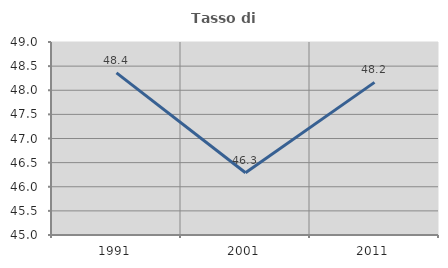
| Category | Tasso di occupazione   |
|---|---|
| 1991.0 | 48.361 |
| 2001.0 | 46.29 |
| 2011.0 | 48.163 |